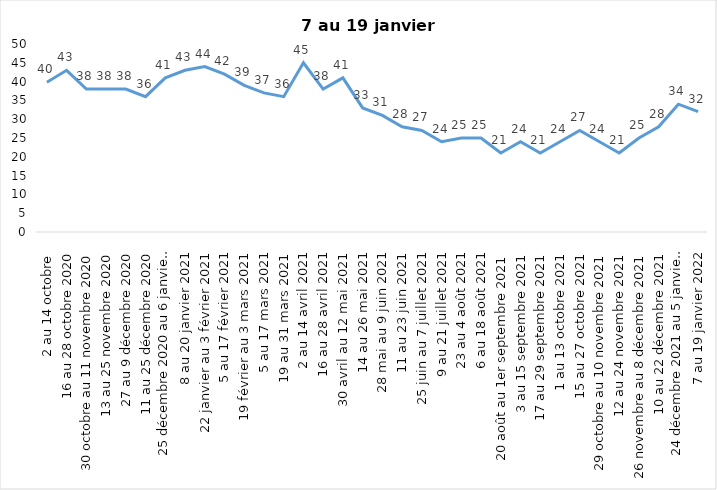
| Category | Toujours aux trois mesures |
|---|---|
| 2 au 14 octobre  | 39.85 |
| 16 au 28 octobre 2020 | 43 |
| 30 octobre au 11 novembre 2020 | 38 |
| 13 au 25 novembre 2020 | 38 |
| 27 au 9 décembre 2020 | 38 |
| 11 au 25 décembre 2020 | 36 |
| 25 décembre 2020 au 6 janvier 2021 | 41 |
| 8 au 20 janvier 2021 | 43 |
| 22 janvier au 3 février 2021 | 44 |
| 5 au 17 février 2021 | 42 |
| 19 février au 3 mars 2021 | 39 |
| 5 au 17 mars 2021 | 37 |
| 19 au 31 mars 2021 | 36 |
| 2 au 14 avril 2021 | 45 |
| 16 au 28 avril 2021 | 38 |
| 30 avril au 12 mai 2021 | 41 |
| 14 au 26 mai 2021 | 33 |
| 28 mai au 9 juin 2021 | 31 |
| 11 au 23 juin 2021 | 28 |
| 25 juin au 7 juillet 2021 | 27 |
| 9 au 21 juillet 2021 | 24 |
| 23 au 4 août 2021 | 25 |
| 6 au 18 août 2021 | 25 |
| 20 août au 1er septembre 2021 | 21 |
| 3 au 15 septembre 2021 | 24 |
| 17 au 29 septembre 2021 | 21 |
| 1 au 13 octobre 2021 | 24 |
| 15 au 27 octobre 2021 | 27 |
| 29 octobre au 10 novembre 2021 | 24 |
| 12 au 24 novembre 2021 | 21 |
| 26 novembre au 8 décembre 2021 | 25 |
| 10 au 22 décembre 2021 | 28 |
| 24 décembre 2021 au 5 janvier 2022 2022 | 34 |
| 7 au 19 janvier 2022 | 32 |